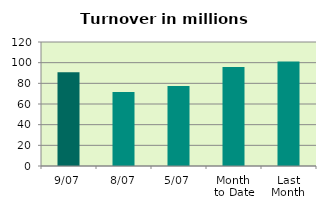
| Category | Series 0 |
|---|---|
| 9/07 | 90.703 |
| 8/07 | 71.601 |
| 5/07 | 77.327 |
| Month 
to Date | 95.748 |
| Last
Month | 101.166 |